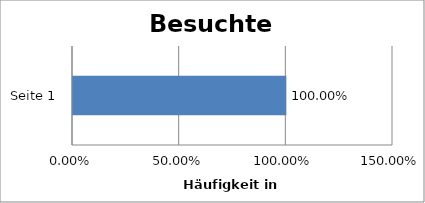
| Category | Seite |
|---|---|
| Seite 1 | 1 |